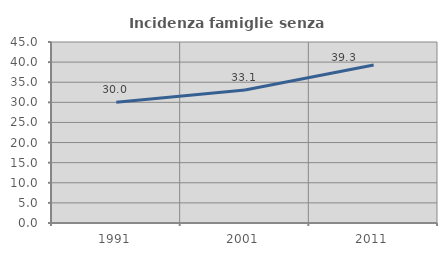
| Category | Incidenza famiglie senza nuclei |
|---|---|
| 1991.0 | 30 |
| 2001.0 | 33.077 |
| 2011.0 | 39.294 |